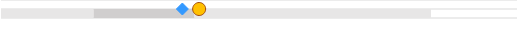
| Category | left | mid start | mid end | right |
|---|---|---|---|---|
| 0 | 0 | 0.215 | 0.235 | 0.55 |